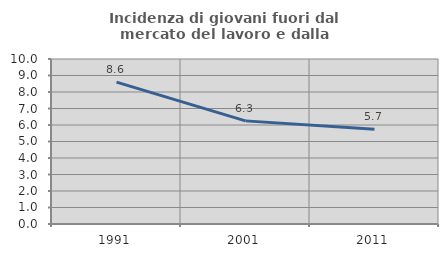
| Category | Incidenza di giovani fuori dal mercato del lavoro e dalla formazione  |
|---|---|
| 1991.0 | 8.602 |
| 2001.0 | 6.25 |
| 2011.0 | 5.743 |